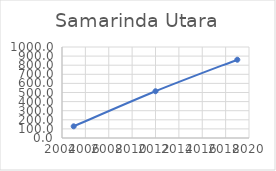
| Category | Series 0 |
|---|---|
| 2005.0 | 128.362 |
| 2012.0 | 513.742 |
| 2019.0 | 860.274 |